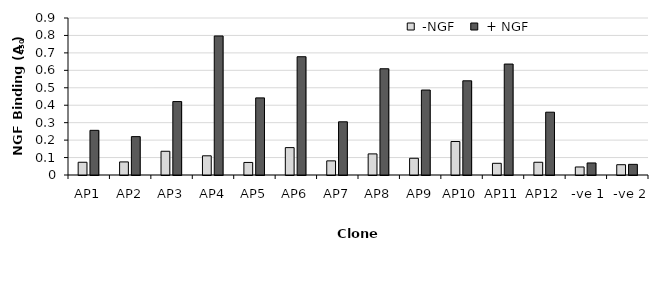
| Category |  -NGF |  + NGF |
|---|---|---|
| AP1 | 0.073 | 0.256 |
| AP2 | 0.075 | 0.22 |
| AP3 | 0.136 | 0.421 |
| AP4 | 0.11 | 0.797 |
| AP5 | 0.072 | 0.442 |
| AP6 | 0.157 | 0.678 |
| AP7 | 0.081 | 0.305 |
| AP8 | 0.121 | 0.609 |
| AP9 | 0.096 | 0.487 |
| AP10 | 0.192 | 0.54 |
| AP11 | 0.067 | 0.636 |
| AP12 | 0.073 | 0.36 |
|  -ve 1 | 0.046 | 0.069 |
|  -ve 2 | 0.059 | 0.061 |